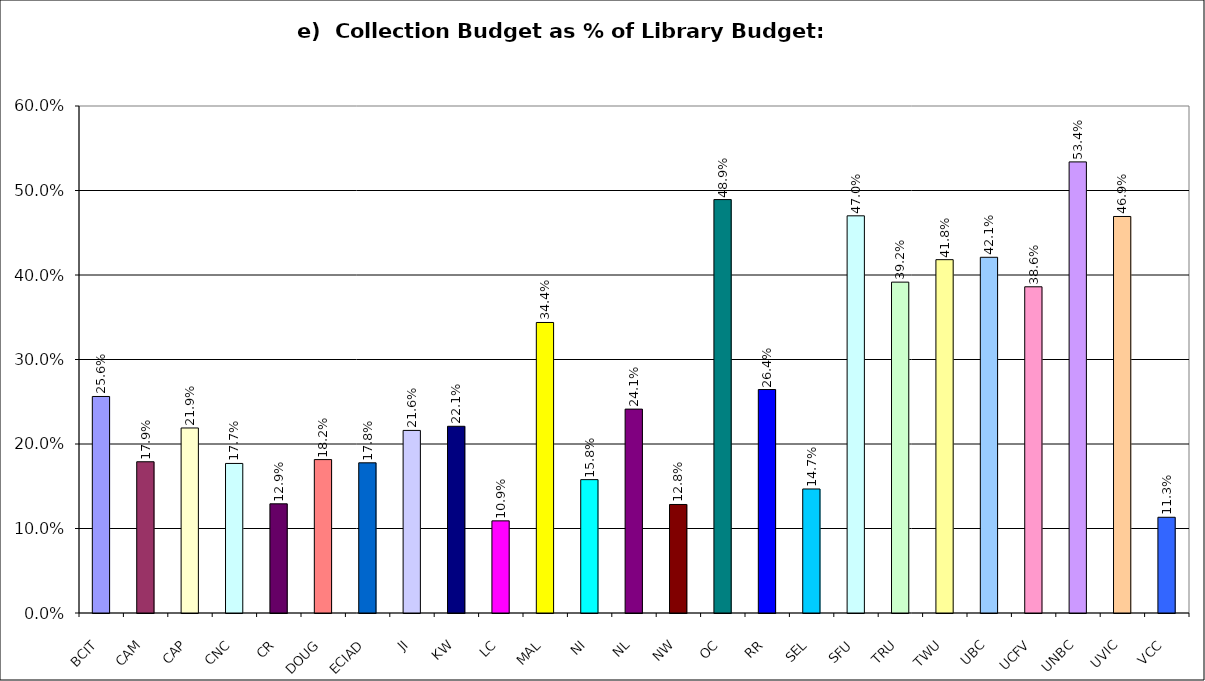
| Category | e)  Collection Budget as % of Library Budget:  7(j)/7(l) |
|---|---|
| BCIT | 0.256 |
| CAM | 0.179 |
| CAP | 0.219 |
| CNC | 0.177 |
| CR | 0.129 |
| DOUG | 0.182 |
| ECIAD | 0.178 |
| JI | 0.216 |
| KW | 0.221 |
| LC | 0.109 |
| MAL | 0.344 |
| NI | 0.158 |
| NL | 0.241 |
| NW | 0.128 |
| OC | 0.489 |
| RR | 0.264 |
| SEL | 0.147 |
| SFU | 0.47 |
| TRU | 0.392 |
| TWU | 0.418 |
| UBC | 0.421 |
| UCFV | 0.386 |
| UNBC | 0.534 |
| UVIC | 0.469 |
| VCC | 0.113 |